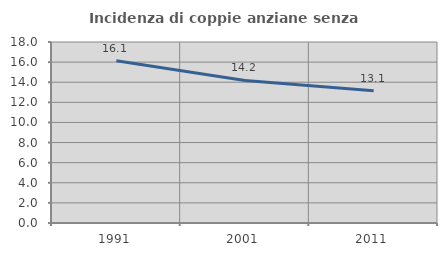
| Category | Incidenza di coppie anziane senza figli  |
|---|---|
| 1991.0 | 16.125 |
| 2001.0 | 14.18 |
| 2011.0 | 13.142 |